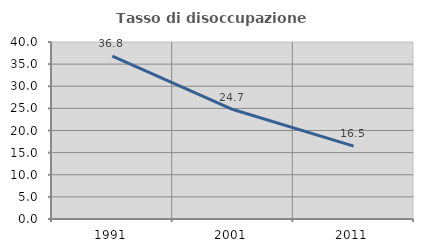
| Category | Tasso di disoccupazione giovanile  |
|---|---|
| 1991.0 | 36.816 |
| 2001.0 | 24.742 |
| 2011.0 | 16.471 |